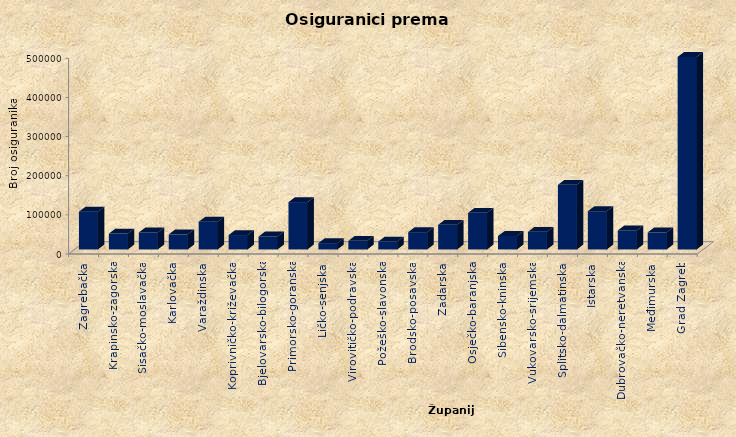
| Category | Series 0 |
|---|---|
| Zagrebačka | 96409 |
| Krapinsko-zagorska | 40631 |
| Sisačko-moslavačka | 43305 |
| Karlovačka | 38529 |
| Varaždinska | 70742 |
| Koprivničko-križevačka | 36803 |
| Bjelovarsko-bilogorska | 33018 |
| Primorsko-goranska | 120885 |
| Ličko-senjska | 16227 |
| Virovitičko-podravska | 22082 |
| Požeško-slavonska | 20200 |
| Brodsko-posavska | 44146 |
| Zadarska | 63025 |
| Osječko-baranjska | 93535 |
| Šibensko-kninska | 34368 |
| Vukovarsko-srijemska | 45135 |
| Splitsko-dalmatinska | 165085 |
| Istarska | 97644 |
| Dubrovačko-neretvanska | 48507 |
| Međimurska | 43624 |
| Grad Zagreb | 491817 |